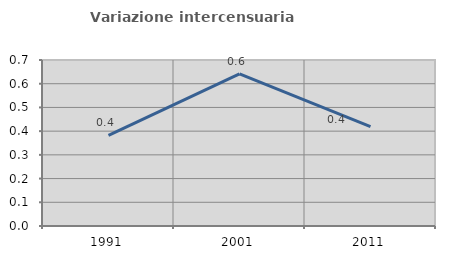
| Category | Variazione intercensuaria annua |
|---|---|
| 1991.0 | 0.382 |
| 2001.0 | 0.641 |
| 2011.0 | 0.419 |